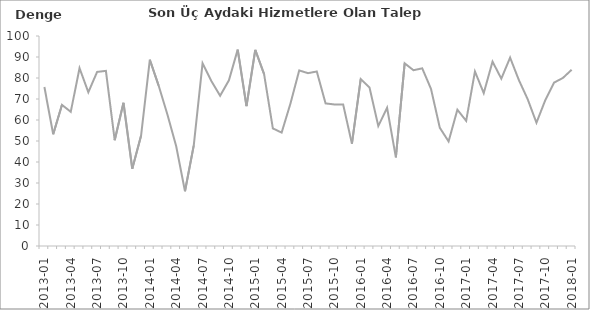
| Category | Denge  |
|---|---|
| 2013-01 | 75.7 |
|  | 53.2 |
|  | 67.2 |
| 2013-04 | 63.9 |
|  | 84.7 |
|  | 73.2 |
| 2013-07 | 82.9 |
|  | 83.4 |
|  | 50.4 |
| 2013-10 | 68.2 |
|  | 36.8 |
|  | 52.5 |
| 2014-01 | 88.7 |
|  | 76.4 |
|  | 62.6 |
| 2014-04 | 47.5 |
|  | 26.1 |
|  | 47.9 |
| 2014-07 | 87 |
|  | 78.6 |
|  | 71.5 |
| 2014-10 | 78.9 |
|  | 93.5 |
|  | 66.6 |
| 2015-01 | 93.4 |
|  | 81.9 |
|  | 56 |
| 2015-04 | 54 |
|  | 67.8 |
|  | 83.6 |
| 2015-07 | 82.3 |
|  | 83.1 |
|  | 67.9 |
| 2015-10 | 67.4 |
|  | 67.4 |
|  | 48.7 |
| 2016-01 | 79.5 |
|  | 75.5 |
|  | 57.1 |
| 2016-04 | 65.8 |
|  | 42.2 |
|  | 87 |
| 2016-07 | 83.7 |
|  | 84.6 |
|  | 74.8 |
| 2016-10 | 56.3 |
|  | 49.8 |
|  | 64.9 |
| 2017-01 | 59.6 |
|  | 83.1 |
|  | 72.8 |
| 2017-04 | 87.8 |
|  | 79.7 |
|  | 89.7 |
| 2017-07 | 79 |
|  | 69.9 |
|  | 58.7 |
| 2017-10 | 69.4 |
|  | 77.8 |
|  | 80 |
| 2018-01 | 83.9 |